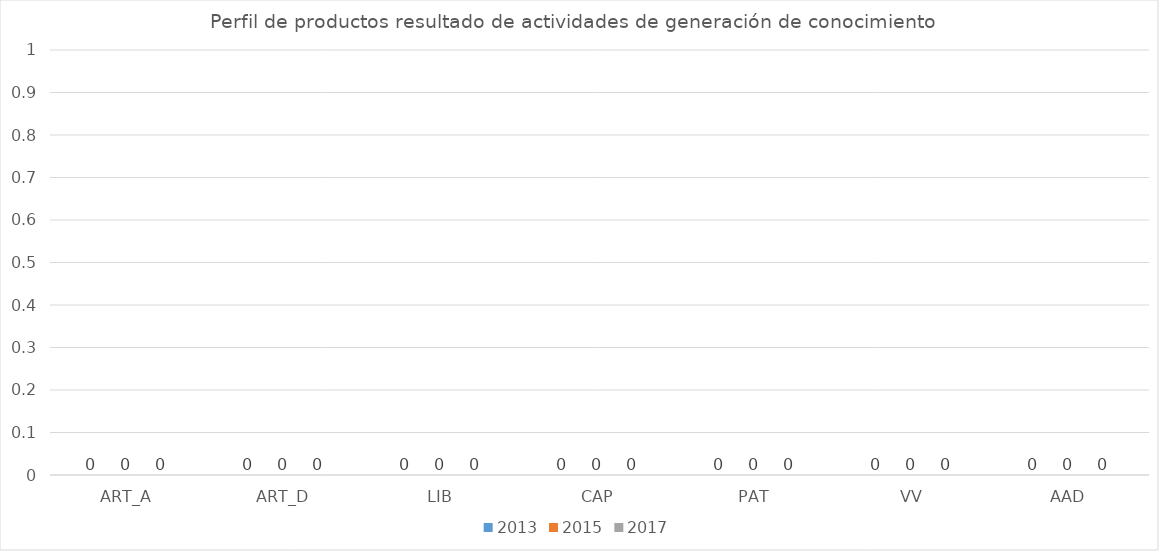
| Category | 2013 | 2015 | 2017 |
|---|---|---|---|
| ART_A | 0 | 0 | 0 |
| ART_D | 0 | 0 | 0 |
| LIB | 0 | 0 | 0 |
| CAP | 0 | 0 | 0 |
| PAT | 0 | 0 | 0 |
| VV | 0 | 0 | 0 |
| AAD | 0 | 0 | 0 |